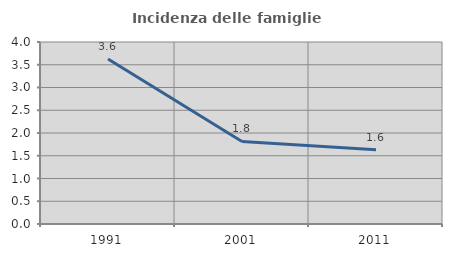
| Category | Incidenza delle famiglie numerose |
|---|---|
| 1991.0 | 3.626 |
| 2001.0 | 1.815 |
| 2011.0 | 1.631 |